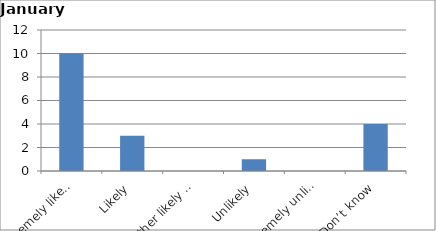
| Category | Series 0 |
|---|---|
| Extremely likely | 10 |
| Likely | 3 |
| Neither likely nor unlikely | 0 |
| Unlikely | 1 |
| Extremely unlikely | 0 |
| Don’t know | 4 |